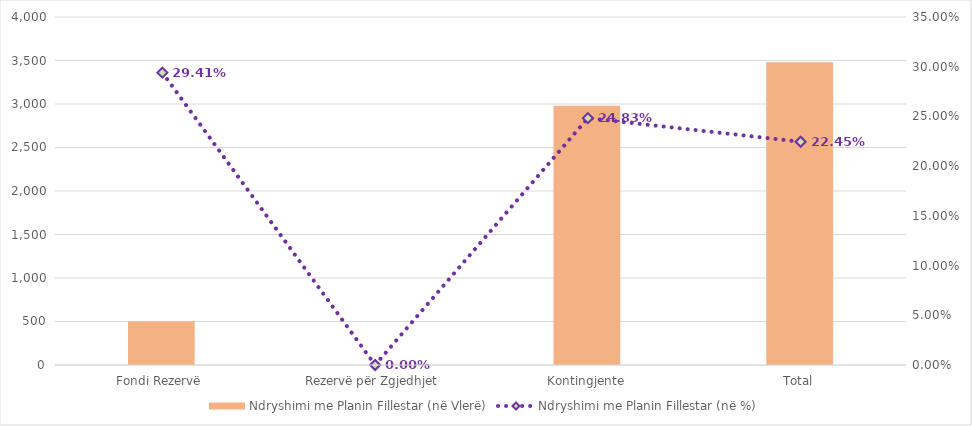
| Category | Ndryshimi me Planin Fillestar (në Vlerë) |
|---|---|
| Fondi Rezervë | 500 |
| Rezervë për Zgjedhjet | 0 |
| Kontingjente | 2980 |
| Total | 3480 |